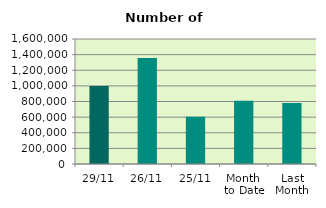
| Category | Series 0 |
|---|---|
| 29/11 | 996942 |
| 26/11 | 1355328 |
| 25/11 | 604480 |
| Month 
to Date | 808508.762 |
| Last
Month | 780428.952 |